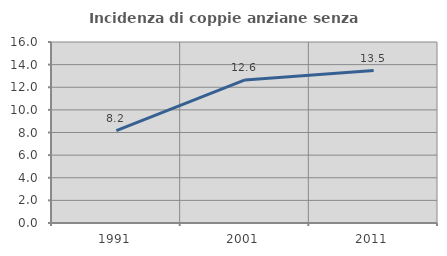
| Category | Incidenza di coppie anziane senza figli  |
|---|---|
| 1991.0 | 8.163 |
| 2001.0 | 12.646 |
| 2011.0 | 13.48 |